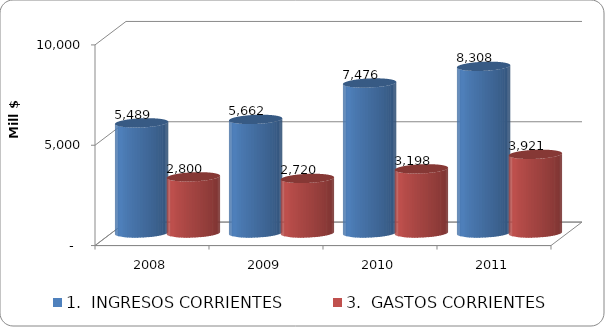
| Category | 1.  INGRESOS CORRIENTES | 3.  GASTOS CORRIENTES |
|---|---|---|
| 2008.0 | 5489.333 | 2800.027 |
| 2009.0 | 5662.218 | 2720.458 |
| 2010.0 | 7476.413 | 3197.838 |
| 2011.0 | 8308 | 3921 |